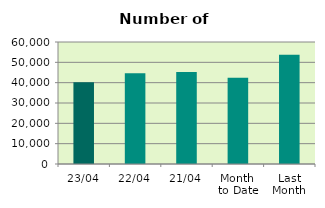
| Category | Series 0 |
|---|---|
| 23/04 | 40192 |
| 22/04 | 44666 |
| 21/04 | 45234 |
| Month 
to Date | 42386.4 |
| Last
Month | 53669.217 |